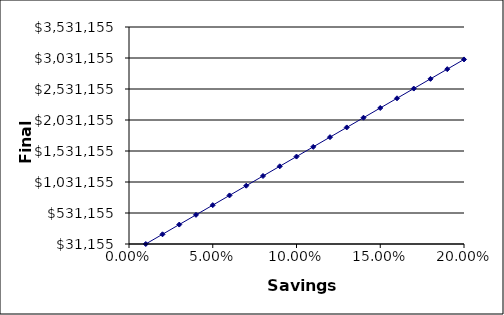
| Category | $H$56 |
|---|---|
| 0.01 | 31154.59 |
| 0.02 | 187838.42 |
| 0.03 | 344522.25 |
| 0.04 | 501206.08 |
| 0.05 | 657889.91 |
| 0.06 | 814573.74 |
| 0.07 | 971257.57 |
| 0.08 | 1127941.4 |
| 0.09 | 1284625.23 |
| 0.1 | 1441309.06 |
| 0.11 | 1597992.89 |
| 0.12 | 1754676.71 |
| 0.13 | 1911360.54 |
| 0.14 | 2068044.37 |
| 0.15 | 2224728.2 |
| 0.16 | 2381412.03 |
| 0.17 | 2538095.86 |
| 0.18 | 2694779.69 |
| 0.19 | 2851463.52 |
| 0.2 | 3008147.35 |